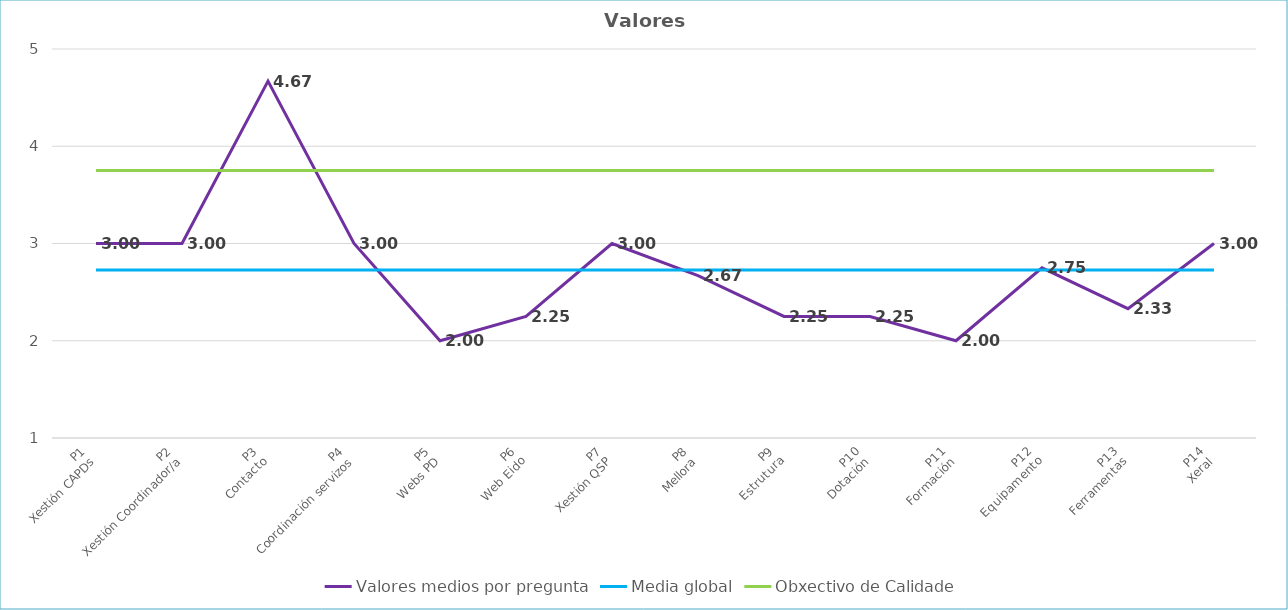
| Category | Valores medios por pregunta | Media global | Obxectivo de Calidade |
|---|---|---|---|
| P1
Xestión CAPDs | 3 | 2.726 | 3.75 |
| P2
Xestión Coordinador/a | 3 | 2.726 | 3.75 |
| P3
Contacto | 4.67 | 2.726 | 3.75 |
| P4
Coordinación servizos | 3 | 2.726 | 3.75 |
| P5
Webs PD | 2 | 2.726 | 3.75 |
| P6
Web Eido | 2.25 | 2.726 | 3.75 |
| P7
Xestión QSP | 3 | 2.726 | 3.75 |
| P8
Mellora | 2.67 | 2.726 | 3.75 |
| P9
Estrutura | 2.25 | 2.726 | 3.75 |
| P10
Dotación | 2.25 | 2.726 | 3.75 |
| P11
Formación | 2 | 2.726 | 3.75 |
| P12
Equipamento | 2.75 | 2.726 | 3.75 |
| P13
Ferramentas | 2.33 | 2.726 | 3.75 |
| P14
Xeral | 3 | 2.726 | 3.75 |